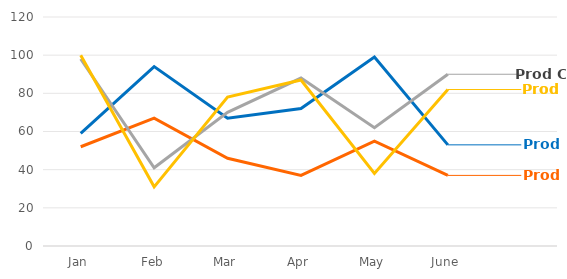
| Category | Series 0 | Series 1 | Series 2 | Series 3 |
|---|---|---|---|---|
| Jan | 59 | 52 | 98 | 100 |
| Feb | 94 | 67 | 41 | 31 |
| Mar | 67 | 46 | 70 | 78 |
| Apr | 72 | 37 | 88 | 87 |
| May | 99 | 55 | 62 | 38 |
| June | 53 | 37 | 90 | 82 |